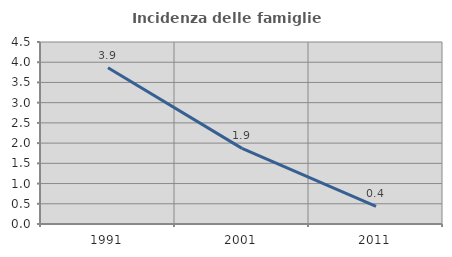
| Category | Incidenza delle famiglie numerose |
|---|---|
| 1991.0 | 3.865 |
| 2001.0 | 1.869 |
| 2011.0 | 0.439 |